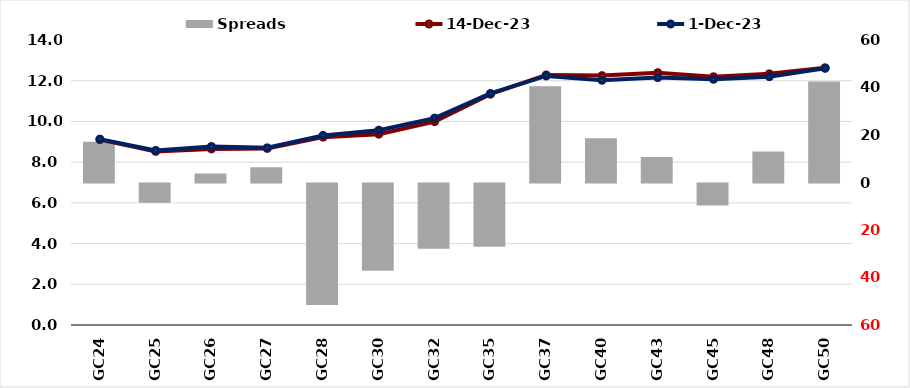
| Category |  Spreads   |
|---|---|
| GC24 | 17.136 |
| GC25 | -8.068 |
| GC26 | 3.809 |
| GC27 | 6.434 |
| GC28 | -51.195 |
| GC30 | -36.693 |
| GC32 | -27.453 |
| GC35 | -26.647 |
| GC37 | 40.529 |
| GC40 | 18.607 |
| GC43 | 10.761 |
| GC45 | -9.308 |
| GC48 | 13.032 |
| GC50 | 42.545 |